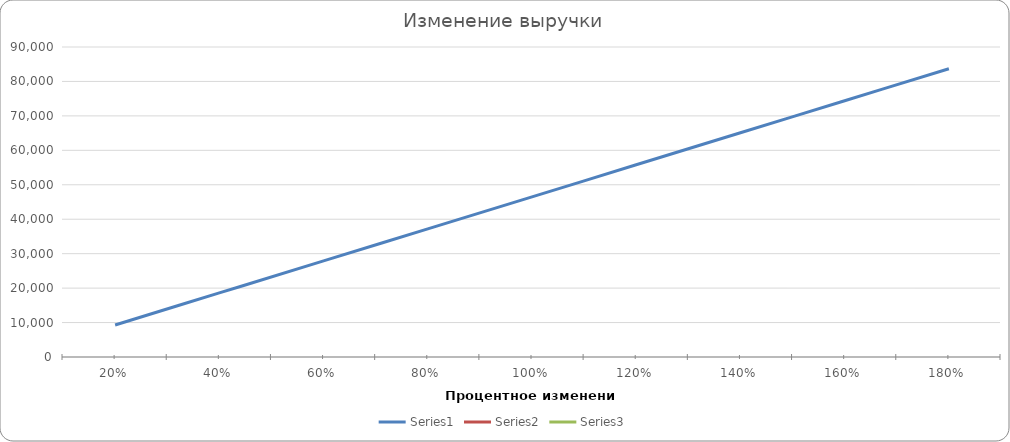
| Category | Series 0 | Series 1 | Series 2 |
|---|---|---|---|
| 0.2 | 9300 | 0 | 0 |
| 0.4 | 18600 | 0 | 0 |
| 0.6 | 27900 | 0 | 0 |
| 0.8 | 37200 | 0 | 0 |
| 1.0 | 46500 | 0 | 0 |
| 1.2 | 55800 | 0 | 0 |
| 1.4 | 651 | 0 | 0 |
| 1.6 | 74400 | 0 | 0 |
| 1.8 | 83700 | 0 | 0 |